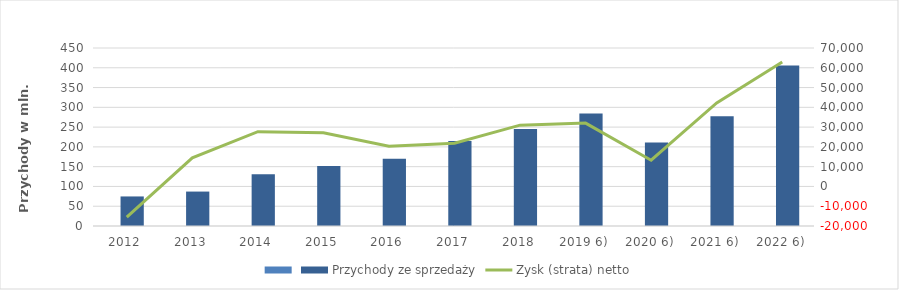
| Category | Series 0 | Przychody ze sprzedaży |
|---|---|---|
| 2012 |  | 74722 |
| 2013 |  | 87044 |
| 2014 |  | 130515 |
| 2015 |  | 151646 |
| 2016 |  | 170280 |
| 2017 |  | 215005 |
| 2018 |  | 245087 |
| 2019 6) |  | 284536 |
| 2020 6) |  | 211040 |
| 2021 6) |  | 277741 |
| 2022 6) |  | 405919 |